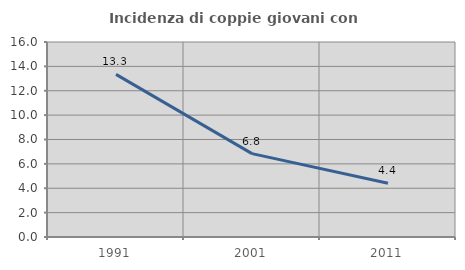
| Category | Incidenza di coppie giovani con figli |
|---|---|
| 1991.0 | 13.344 |
| 2001.0 | 6.841 |
| 2011.0 | 4.412 |